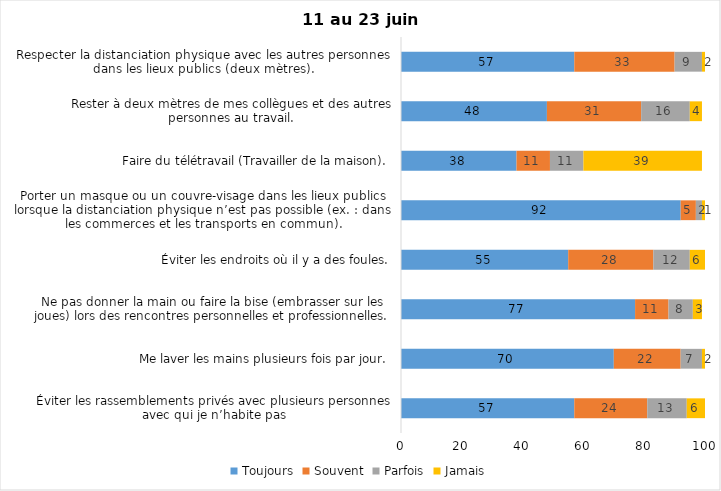
| Category | Toujours | Souvent | Parfois | Jamais |
|---|---|---|---|---|
| Éviter les rassemblements privés avec plusieurs personnes avec qui je n’habite pas | 57 | 24 | 13 | 6 |
| Me laver les mains plusieurs fois par jour. | 70 | 22 | 7 | 2 |
| Ne pas donner la main ou faire la bise (embrasser sur les joues) lors des rencontres personnelles et professionnelles. | 77 | 11 | 8 | 3 |
| Éviter les endroits où il y a des foules. | 55 | 28 | 12 | 6 |
| Porter un masque ou un couvre-visage dans les lieux publics lorsque la distanciation physique n’est pas possible (ex. : dans les commerces et les transports en commun). | 92 | 5 | 2 | 1 |
| Faire du télétravail (Travailler de la maison). | 38 | 11 | 11 | 39 |
| Rester à deux mètres de mes collègues et des autres personnes au travail. | 48 | 31 | 16 | 4 |
| Respecter la distanciation physique avec les autres personnes dans les lieux publics (deux mètres). | 57 | 33 | 9 | 2 |